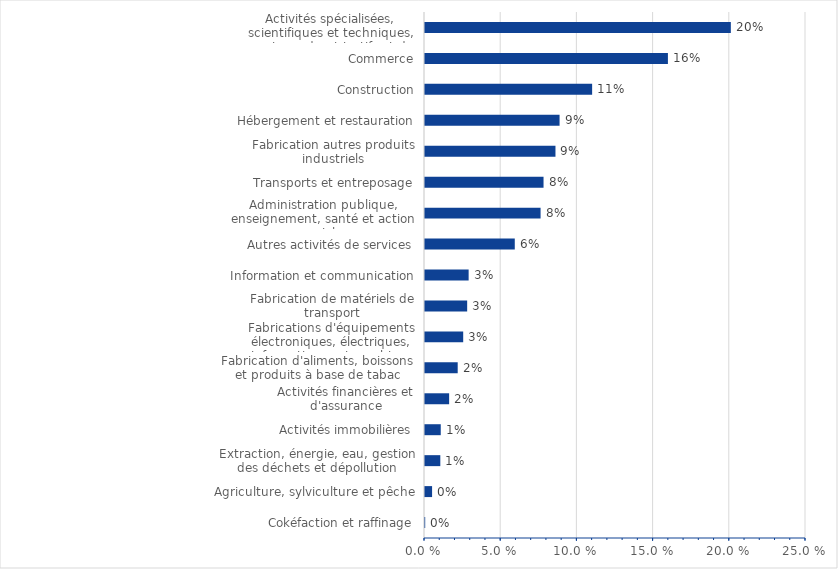
| Category | Series 0 |
|---|---|
| Cokéfaction et raffinage | 0 |
| Agriculture, sylviculture et pêche | 0.005 |
| Extraction, énergie, eau, gestion des déchets et dépollution | 0.01 |
| Activités immobilières | 0.01 |
| Activités financières et d'assurance | 0.016 |
| Fabrication d'aliments, boissons et produits à base de tabac | 0.021 |
| Fabrications d'équipements électroniques, électriques, informatiques et machines | 0.025 |
| Fabrication de matériels de transport | 0.028 |
| Information et communication | 0.029 |
| Autres activités de services | 0.059 |
| Administration publique, enseignement, santé et action sociale | 0.076 |
| Transports et entreposage | 0.078 |
| Fabrication autres produits industriels | 0.086 |
| Hébergement et restauration | 0.088 |
| Construction | 0.11 |
| Commerce | 0.159 |
| Activités spécialisées, scientifiques et techniques, services admnistratifs et de soutien | 0.201 |